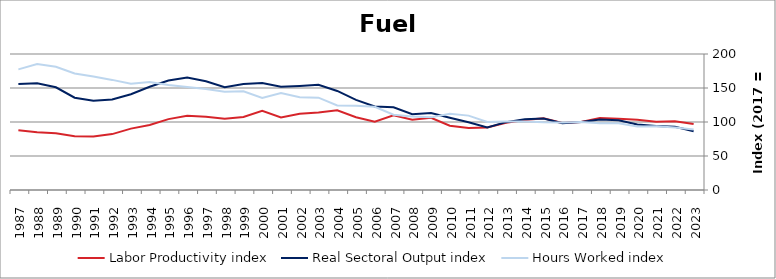
| Category | Labor Productivity index | Real Sectoral Output index | Hours Worked index |
|---|---|---|---|
| 2023.0 | 97.179 | 86.371 | 88.878 |
| 2022.0 | 101.056 | 92.951 | 91.98 |
| 2021.0 | 100.426 | 94.243 | 93.843 |
| 2020.0 | 103.176 | 96.493 | 93.523 |
| 2019.0 | 104.617 | 102.525 | 98.001 |
| 2018.0 | 105.724 | 103.78 | 98.162 |
| 2017.0 | 100 | 100 | 100 |
| 2016.0 | 98.599 | 98.043 | 99.436 |
| 2015.0 | 105.422 | 105.012 | 99.611 |
| 2014.0 | 103.054 | 103.896 | 100.817 |
| 2013.0 | 99.033 | 99.788 | 100.762 |
| 2012.0 | 91.911 | 91.946 | 100.038 |
| 2011.0 | 91.108 | 99.656 | 109.383 |
| 2010.0 | 94.61 | 106.208 | 112.258 |
| 2009.0 | 106.096 | 113.322 | 106.811 |
| 2008.0 | 103.284 | 111.548 | 108.002 |
| 2007.0 | 109.881 | 121.755 | 110.807 |
| 2006.0 | 100.443 | 122.889 | 122.348 |
| 2005.0 | 106.898 | 132.62 | 124.062 |
| 2004.0 | 117.276 | 145.696 | 124.233 |
| 2003.0 | 113.918 | 154.705 | 135.804 |
| 2002.0 | 112.166 | 153.091 | 136.486 |
| 2001.0 | 106.603 | 151.839 | 142.433 |
| 2000.0 | 116.409 | 157.427 | 135.236 |
| 1999.0 | 107.25 | 155.736 | 145.209 |
| 1998.0 | 104.721 | 151.24 | 144.422 |
| 1997.0 | 107.747 | 159.91 | 148.412 |
| 1996.0 | 109.224 | 165.443 | 151.471 |
| 1995.0 | 104.267 | 160.997 | 154.408 |
| 1994.0 | 95.624 | 151.779 | 158.725 |
| 1993.0 | 90.266 | 140.913 | 156.109 |
| 1992.0 | 82.202 | 133.104 | 161.923 |
| 1991.0 | 78.651 | 131.276 | 166.909 |
| 1990.0 | 79.193 | 135.743 | 171.407 |
| 1989.0 | 83.284 | 151.013 | 181.323 |
| 1988.0 | 84.758 | 156.885 | 185.098 |
| 1987.0 | 87.835 | 155.79 | 177.367 |